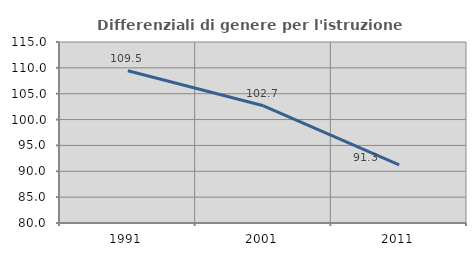
| Category | Differenziali di genere per l'istruzione superiore |
|---|---|
| 1991.0 | 109.455 |
| 2001.0 | 102.659 |
| 2011.0 | 91.261 |